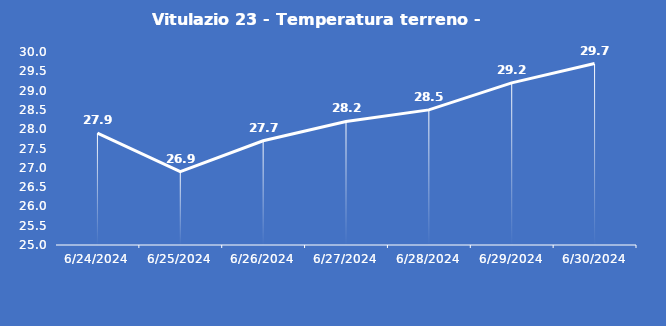
| Category | Vitulazio 23 - Temperatura terreno - Grezzo (°C) |
|---|---|
| 6/24/24 | 27.9 |
| 6/25/24 | 26.9 |
| 6/26/24 | 27.7 |
| 6/27/24 | 28.2 |
| 6/28/24 | 28.5 |
| 6/29/24 | 29.2 |
| 6/30/24 | 29.7 |